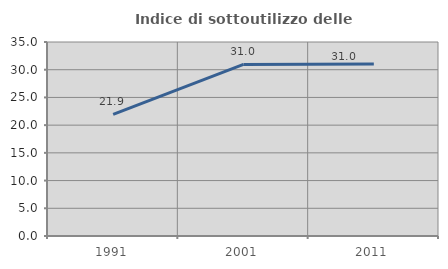
| Category | Indice di sottoutilizzo delle abitazioni  |
|---|---|
| 1991.0 | 21.939 |
| 2001.0 | 30.952 |
| 2011.0 | 31.034 |